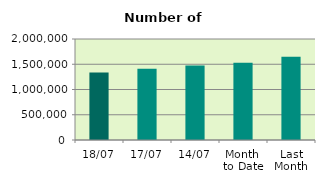
| Category | Series 0 |
|---|---|
| 18/07 | 1334882 |
| 17/07 | 1409808 |
| 14/07 | 1477244 |
| Month 
to Date | 1530247.667 |
| Last
Month | 1646651.818 |